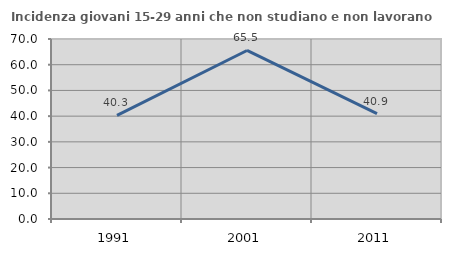
| Category | Incidenza giovani 15-29 anni che non studiano e non lavorano  |
|---|---|
| 1991.0 | 40.288 |
| 2001.0 | 65.54 |
| 2011.0 | 40.945 |